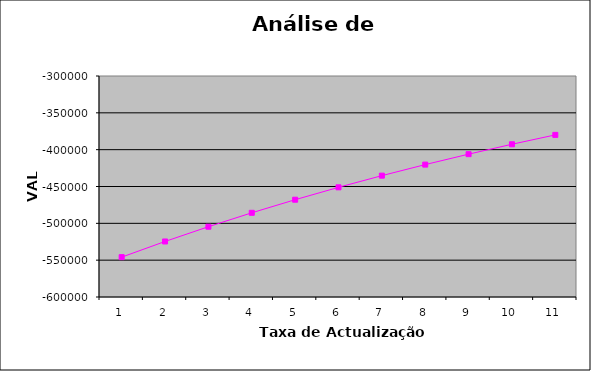
| Category | Series 0 | Series 1 |
|---|---|---|
| 0 | 5 | -545909.872 |
| 1 | 6 | -524622.68 |
| 2 | 7 | -504589.075 |
| 3 | 8 | -485717.671 |
| 4 | 9 | -467924.806 |
| 5 | 10 | -451133.801 |
| 6 | 11 | -435274.312 |
| 7 | 12 | -420281.74 |
| 8 | 13 | -406096.705 |
| 9 | 14 | -392664.567 |
| 10 | 15 | -379935.007 |